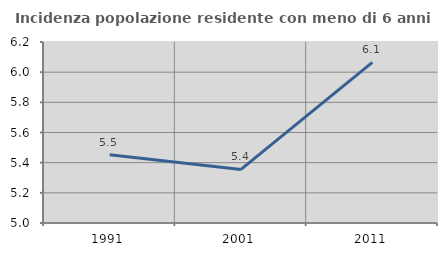
| Category | Incidenza popolazione residente con meno di 6 anni |
|---|---|
| 1991.0 | 5.452 |
| 2001.0 | 5.355 |
| 2011.0 | 6.065 |